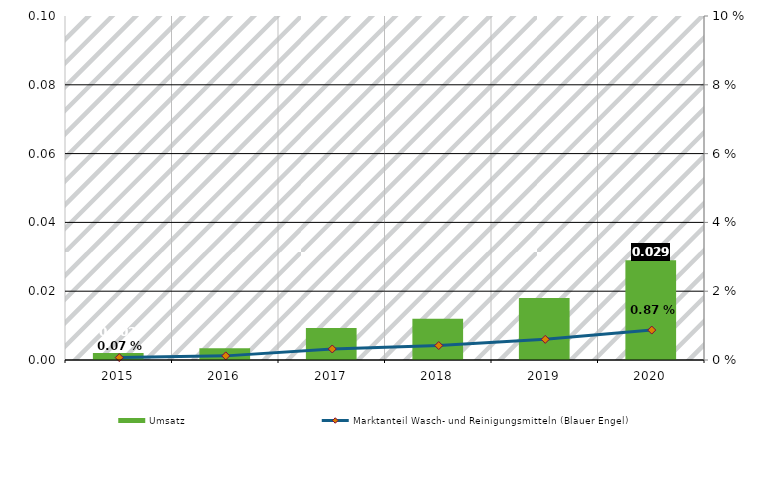
| Category | Umsatz |
|---|---|
| 2015.0 | 0.002 |
| 2016.0 | 0.003 |
| 2017.0 | 0.009 |
| 2018.0 | 0.012 |
| 2019.0 | 0.018 |
| 2020.0 | 0.029 |